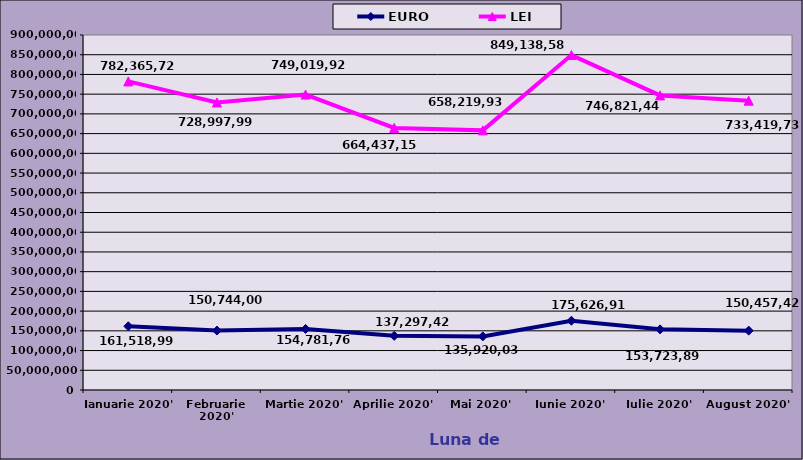
| Category | EURO | Series 1 | LEI |
|---|---|---|---|
| Ianuarie 2020' | 161518999 |  | 782365727 |
| Februarie 2020' | 150744001.654 |  | 728997992 |
| Martie 2020' | 154781765.994 |  | 749019922 |
| Aprilie 2020' | 137297424 |  | 664437156 |
| Mai 2020' | 135920030.768 |  | 658219933 |
| Iunie 2020' | 175626918 |  | 849138586 |
| Iulie 2020' | 153723899 |  | 746821446 |
| August 2020' | 150457420 |  | 733419739 |